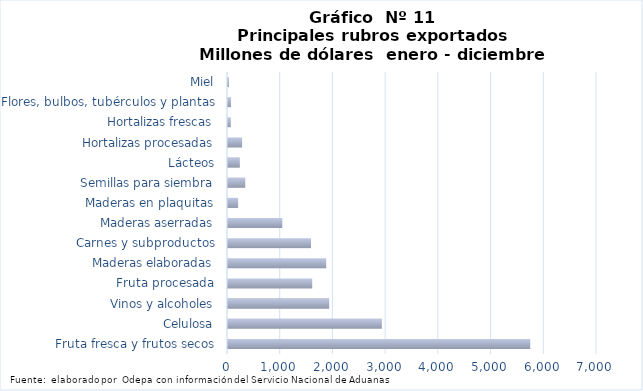
| Category | Series 7 |
|---|---|
| Fruta fresca y frutos secos | 5733573.065 |
| Celulosa | 2918520.14 |
| Vinos y alcoholes | 1920240.721 |
| Fruta procesada | 1597898.73 |
| Maderas elaboradas | 1862522.006 |
| Carnes y subproductos | 1574714.132 |
| Maderas aserradas | 1030217.731 |
| Maderas en plaquitas | 191960.501 |
| Semillas para siembra | 327687.997 |
| Lácteos | 224390.379 |
| Hortalizas procesadas | 268139.466 |
| Hortalizas frescas | 53155.185 |
| Flores, bulbos, tubérculos y plantas | 57174.139 |
| Miel | 17053.39 |